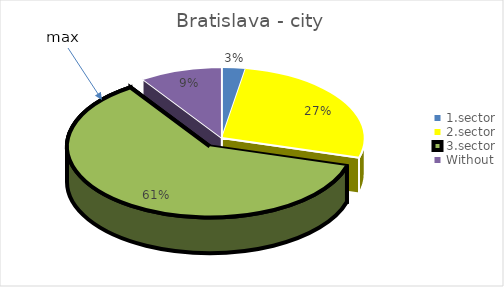
| Category | Bratislava - city |
|---|---|
| 1.sector | 0.027 |
| 2.sector | 0.268 |
| 3.sector | 0.611 |
| Without | 0.094 |